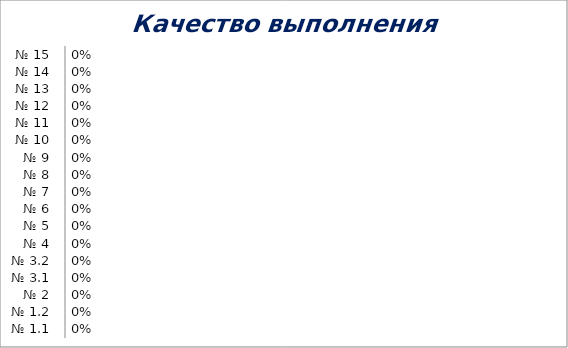
| Category | Series 0 |
|---|---|
| № 1.1 | 0 |
| № 1.2 | 0 |
| № 2 | 0 |
| № 3.1 | 0 |
| № 3.2 | 0 |
| № 4 | 0 |
| № 5 | 0 |
| № 6 | 0 |
| № 7 | 0 |
| № 8 | 0 |
| № 9 | 0 |
| № 10 | 0 |
| № 11 | 0 |
| № 12 | 0 |
| № 13 | 0 |
| № 14 | 0 |
| № 15 | 0 |